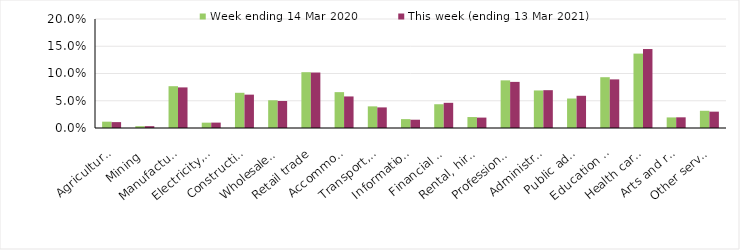
| Category | Week ending 14 Mar 2020 | This week (ending 13 Mar 2021) |
|---|---|---|
| Agriculture, forestry and fishing | 0.012 | 0.011 |
| Mining | 0.003 | 0.003 |
| Manufacturing | 0.077 | 0.074 |
| Electricity, gas, water and waste services | 0.01 | 0.01 |
| Construction | 0.065 | 0.061 |
| Wholesale trade | 0.051 | 0.05 |
| Retail trade | 0.102 | 0.102 |
| Accommodation and food services | 0.066 | 0.058 |
| Transport, postal and warehousing | 0.04 | 0.038 |
| Information media and telecommunications | 0.016 | 0.015 |
| Financial and insurance services | 0.044 | 0.046 |
| Rental, hiring and real estate services | 0.02 | 0.019 |
| Professional, scientific and technical services | 0.087 | 0.085 |
| Administrative and support services | 0.069 | 0.069 |
| Public administration and safety | 0.054 | 0.059 |
| Education and training | 0.093 | 0.089 |
| Health care and social assistance | 0.136 | 0.145 |
| Arts and recreation services | 0.019 | 0.02 |
| Other services | 0.032 | 0.03 |